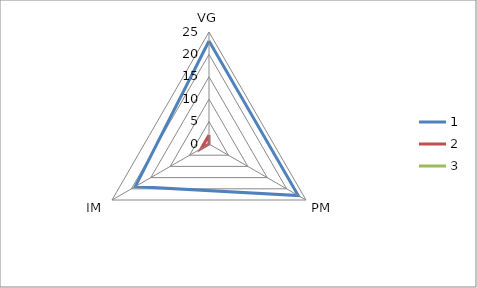
| Category | 1 | 2 | 3 |
|---|---|---|---|
| 0 | 23 | 2 | 0 |
| 1 | 23 | 0 | 0 |
| 2 | 19 | 2 | 0 |